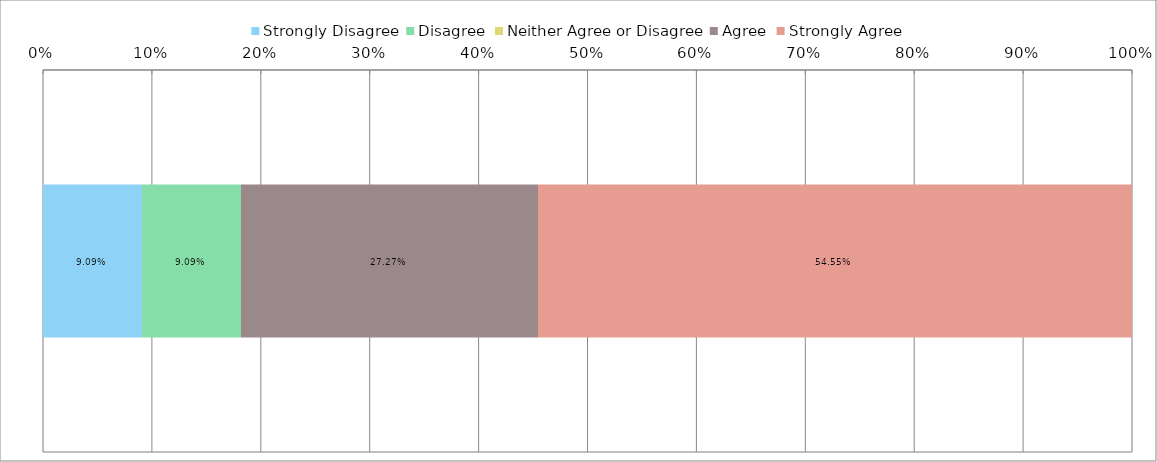
| Category | Strongly Disagree | Disagree | Neither Agree or Disagree | Agree | Strongly Agree |
|---|---|---|---|---|---|
| 0 | 0.091 | 0.091 | 0 | 0.273 | 0.545 |